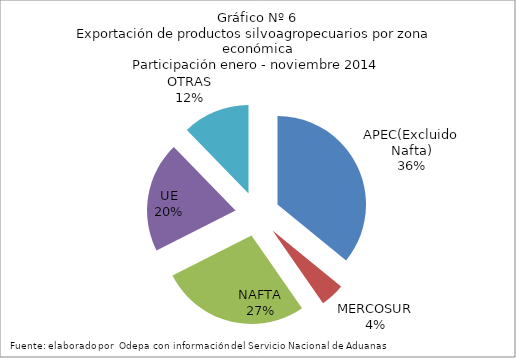
| Category | Series 0 |
|---|---|
| APEC(Excluido Nafta) | 5202774.772 |
| MERCOSUR | 645498.568 |
| NAFTA | 3945634.951 |
| UE | 2926430.41 |
| OTRAS | 1779274.299 |